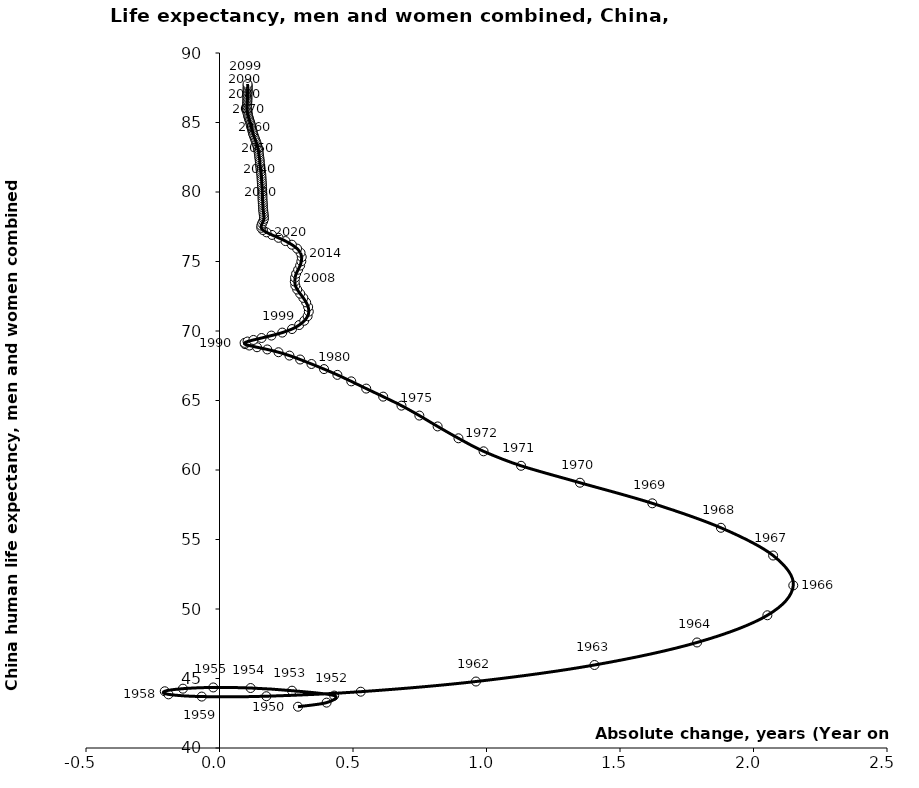
| Category | Series 0 |
|---|---|
| 0.29400000000000404 | 42.97 |
| 0.4009999999999998 | 43.264 |
| 0.42949999999999733 | 43.772 |
| 0.27149999999999963 | 44.123 |
| 0.11650000000000205 | 44.315 |
| -0.023499999999998522 | 44.356 |
| -0.13700000000000045 | 44.268 |
| -0.20500000000000185 | 44.082 |
| -0.19099999999999895 | 43.858 |
| -0.06649999999999778 | 43.7 |
| 0.17549999999999955 | 43.725 |
| 0.5289999999999999 | 44.051 |
| 0.9604999999999997 | 44.783 |
| 1.4044999999999987 | 45.972 |
| 1.788499999999999 | 47.592 |
| 2.0519999999999996 | 49.549 |
| 2.149000000000001 | 51.696 |
| 2.073500000000003 | 53.847 |
| 1.8780000000000001 | 55.843 |
| 1.6209999999999987 | 57.603 |
| 1.3499999999999979 | 59.085 |
| 1.1295000000000002 | 60.303 |
| 0.9890000000000008 | 61.344 |
| 0.8949999999999996 | 62.281 |
| 0.8170000000000002 | 63.134 |
| 0.7484999999999999 | 63.915 |
| 0.6815000000000033 | 64.631 |
| 0.6129999999999995 | 65.278 |
| 0.5494999999999948 | 65.857 |
| 0.4934999999999974 | 66.377 |
| 0.4415000000000049 | 66.844 |
| 0.3915000000000006 | 67.26 |
| 0.3444999999999965 | 67.627 |
| 0.3019999999999996 | 67.949 |
| 0.26200000000000045 | 68.231 |
| 0.22100000000000364 | 68.473 |
| 0.17900000000000205 | 68.673 |
| 0.14049999999999585 | 68.831 |
| 0.11149999999999949 | 68.954 |
| 0.09550000000000125 | 69.054 |
| 0.0940000000000012 | 69.145 |
| 0.10500000000000398 | 69.242 |
| 0.12699999999999534 | 69.355 |
| 0.15749999999999886 | 69.496 |
| 0.194500000000005 | 69.67 |
| 0.23499999999999943 | 69.885 |
| 0.2714999999999961 | 70.14 |
| 0.2984999999999971 | 70.428 |
| 0.31750000000000256 | 70.737 |
| 0.3300000000000054 | 71.063 |
| 0.33449999999999847 | 71.397 |
| 0.33200000000000074 | 71.732 |
| 0.32450000000000045 | 72.061 |
| 0.31399999999999295 | 72.381 |
| 0.3019999999999996 | 72.689 |
| 0.2910000000000039 | 72.985 |
| 0.2839999999999989 | 73.271 |
| 0.2819999999999965 | 73.553 |
| 0.28300000000000125 | 73.835 |
| 0.28700000000000614 | 74.119 |
| 0.2944999999999993 | 74.409 |
| 0.3019999999999996 | 74.708 |
| 0.3064999999999998 | 75.013 |
| 0.30799999999999983 | 75.321 |
| 0.30349999999999966 | 75.629 |
| 0.29049999999999443 | 75.928 |
| 0.2710000000000008 | 76.21 |
| 0.2469999999999999 | 76.47 |
| 0.22100000000000364 | 76.704 |
| 0.19650000000000034 | 76.912 |
| 0.17599999999999483 | 77.097 |
| 0.16250000000000142 | 77.264 |
| 0.1565000000000012 | 77.422 |
| 0.1565000000000012 | 77.577 |
| 0.1595000000000013 | 77.735 |
| 0.1634999999999991 | 77.896 |
| 0.1664999999999992 | 78.062 |
| 0.1664999999999992 | 78.229 |
| 0.16550000000000153 | 78.395 |
| 0.16450000000000387 | 78.56 |
| 0.1634999999999991 | 78.724 |
| 0.1629999999999967 | 78.887 |
| 0.16250000000000142 | 79.05 |
| 0.16199999999999903 | 79.212 |
| 0.16149999999999665 | 79.374 |
| 0.16100000000000136 | 79.535 |
| 0.16100000000000136 | 79.696 |
| 0.16049999999999898 | 79.857 |
| 0.1600000000000037 | 80.017 |
| 0.1600000000000037 | 80.177 |
| 0.1594999999999942 | 80.337 |
| 0.15899999999999892 | 80.496 |
| 0.15850000000000364 | 80.655 |
| 0.15800000000000125 | 80.813 |
| 0.15749999999999886 | 80.971 |
| 0.15699999999999648 | 81.128 |
| 0.1565000000000012 | 81.285 |
| 0.15500000000000114 | 81.441 |
| 0.15399999999999636 | 81.595 |
| 0.15350000000000108 | 81.749 |
| 0.15200000000000102 | 81.902 |
| 0.15099999999999625 | 82.053 |
| 0.15100000000000335 | 82.204 |
| 0.15000000000000568 | 82.355 |
| 0.1490000000000009 | 82.504 |
| 0.14799999999999613 | 82.653 |
| 0.14699999999999847 | 82.8 |
| 0.1460000000000008 | 82.947 |
| 0.14450000000000074 | 83.092 |
| 0.14300000000000068 | 83.236 |
| 0.14099999999999824 | 83.378 |
| 0.1385000000000005 | 83.518 |
| 0.13600000000000279 | 83.655 |
| 0.13349999999999795 | 83.79 |
| 0.13100000000000023 | 83.922 |
| 0.1285000000000025 | 84.052 |
| 0.12599999999999767 | 84.179 |
| 0.12449999999999761 | 84.304 |
| 0.12299999999999756 | 84.428 |
| 0.12100000000000222 | 84.55 |
| 0.11899999999999977 | 84.67 |
| 0.11749999999999972 | 84.788 |
| 0.11650000000000205 | 84.905 |
| 0.1144999999999996 | 85.021 |
| 0.11249999999999716 | 85.134 |
| 0.1109999999999971 | 85.246 |
| 0.10900000000000176 | 85.356 |
| 0.1075000000000017 | 85.464 |
| 0.10650000000000404 | 85.571 |
| 0.10500000000000398 | 85.677 |
| 0.1039999999999992 | 85.781 |
| 0.10349999999999682 | 85.885 |
| 0.10299999999999443 | 85.988 |
| 0.10300000000000153 | 86.091 |
| 0.10350000000000392 | 86.194 |
| 0.1039999999999992 | 86.298 |
| 0.1039999999999992 | 86.402 |
| 0.1039999999999992 | 86.506 |
| 0.10450000000000159 | 86.61 |
| 0.10450000000000159 | 86.715 |
| 0.10450000000000159 | 86.819 |
| 0.10450000000000159 | 86.924 |
| 0.10449999999999449 | 87.028 |
| 0.10499999999999687 | 87.133 |
| 0.10549999999999926 | 87.238 |
| 0.10549999999999926 | 87.344 |
| 0.10500000000000398 | 87.449 |
| 0.10549999999999926 | 87.554 |
| 0.10549999999999926 | 87.66 |
| 0.10500000000000398 | 87.765 |